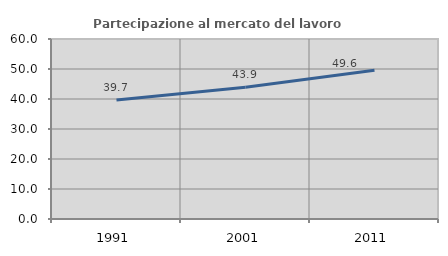
| Category | Partecipazione al mercato del lavoro  femminile |
|---|---|
| 1991.0 | 39.665 |
| 2001.0 | 43.922 |
| 2011.0 | 49.601 |